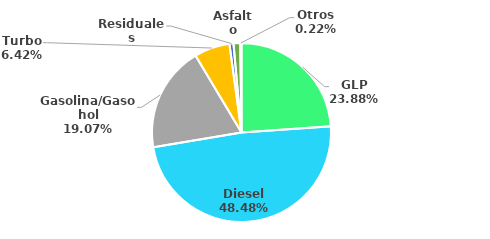
| Category | MBPD |
|---|---|
| GLP | 68.45 |
| Diesel | 138.949 |
| Gasolina/Gasohol | 54.646 |
| Turbo | 18.398 |
| Residuales | 2.063 |
| Asfalto | 3.486 |
| Otros | 0.629 |